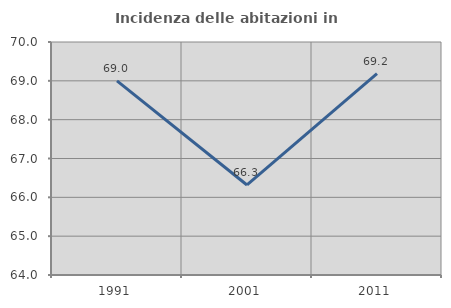
| Category | Incidenza delle abitazioni in proprietà  |
|---|---|
| 1991.0 | 68.999 |
| 2001.0 | 66.318 |
| 2011.0 | 69.188 |